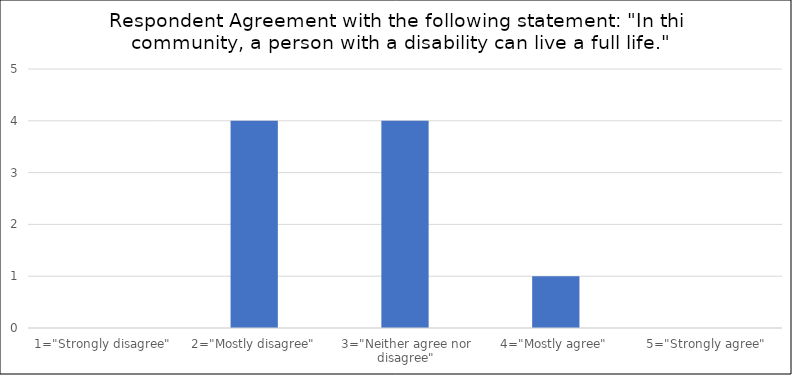
| Category | Number of Responses |
|---|---|
| 1="Strongly disagree" | 0 |
| 2="Mostly disagree" | 4 |
| 3="Neither agree nor disagree" | 4 |
| 4="Mostly agree" | 1 |
| 5="Strongly agree" | 0 |